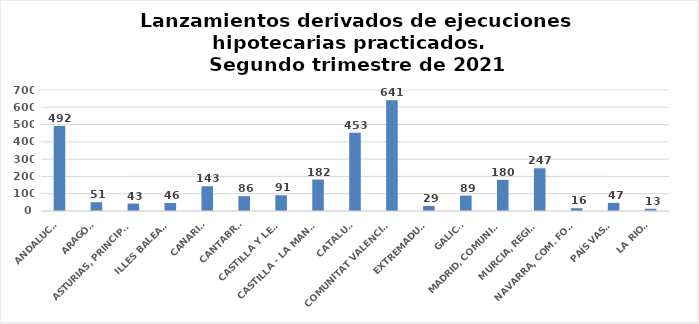
| Category | Series 0 |
|---|---|
| ANDALUCÍA | 492 |
| ARAGÓN | 51 |
| ASTURIAS, PRINCIPADO | 43 |
| ILLES BALEARS | 46 |
| CANARIAS | 143 |
| CANTABRIA | 86 |
| CASTILLA Y LEÓN | 91 |
| CASTILLA - LA MANCHA | 182 |
| CATALUÑA | 453 |
| COMUNITAT VALENCIANA | 641 |
| EXTREMADURA | 29 |
| GALICIA | 89 |
| MADRID, COMUNIDAD | 180 |
| MURCIA, REGIÓN | 247 |
| NAVARRA, COM. FORAL | 16 |
| PAÍS VASCO | 47 |
| LA RIOJA | 13 |